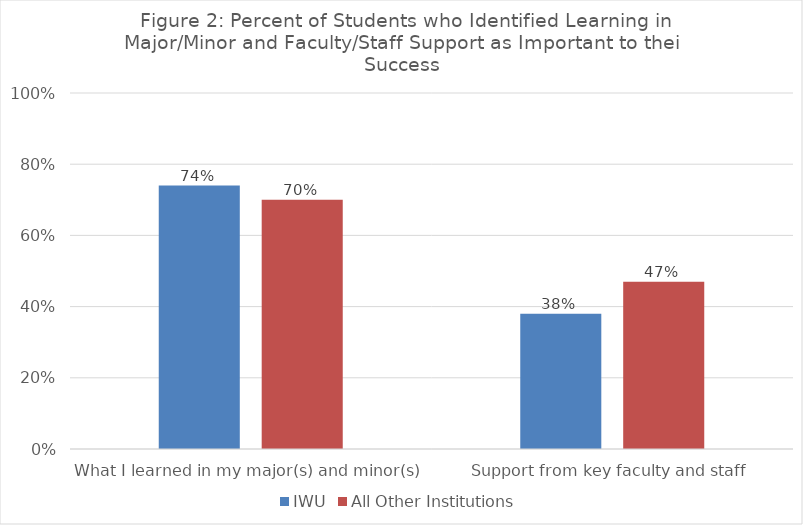
| Category | IWU | All Other Institutions |
|---|---|---|
| What I learned in my major(s) and minor(s) | 0.74 | 0.7 |
| Support from key faculty and staff | 0.38 | 0.47 |